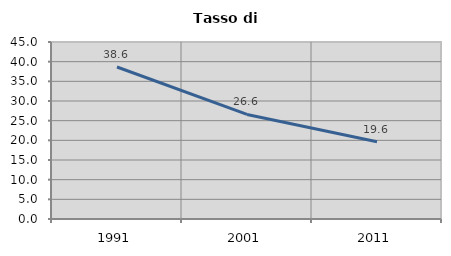
| Category | Tasso di disoccupazione   |
|---|---|
| 1991.0 | 38.646 |
| 2001.0 | 26.591 |
| 2011.0 | 19.627 |